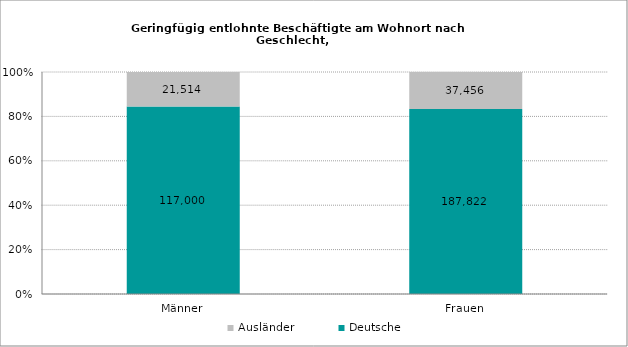
| Category | Deutsche | Ausländer |
|---|---|---|
| Männer | 117000 | 21514 |
| Frauen | 187822 | 37456 |